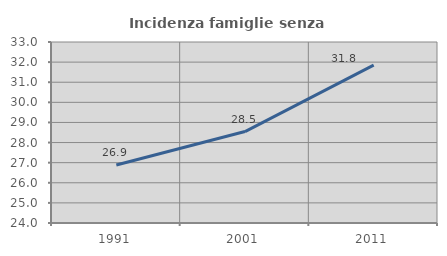
| Category | Incidenza famiglie senza nuclei |
|---|---|
| 1991.0 | 26.884 |
| 2001.0 | 28.546 |
| 2011.0 | 31.848 |